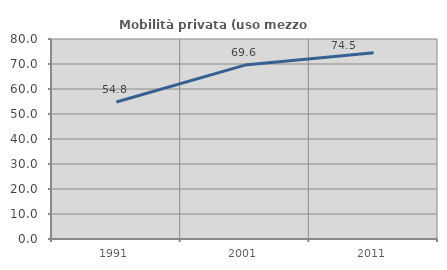
| Category | Mobilità privata (uso mezzo privato) |
|---|---|
| 1991.0 | 54.776 |
| 2001.0 | 69.555 |
| 2011.0 | 74.48 |